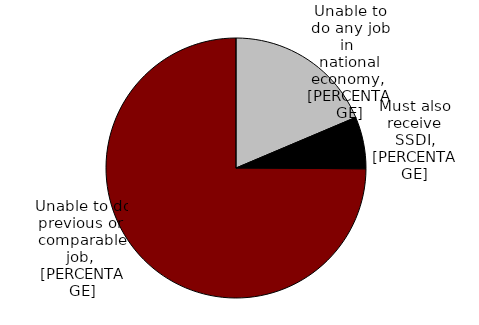
| Category | Series 0 |
|---|---|
| Unable to do any job in national economy | 0.186 |
| Must also receive SSDI | 0.065 |
| Unable to do previous or comparable job | 0.749 |